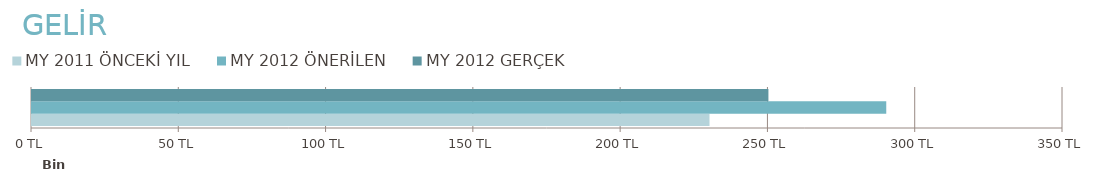
| Category | MY 2011 | MY 2012 |
|---|---|---|
| 0 | 230000 | 250000 |